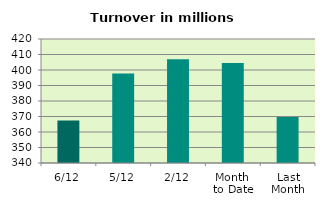
| Category | Series 0 |
|---|---|
| 6/12 | 367.499 |
| 5/12 | 397.762 |
| 2/12 | 406.886 |
| Month 
to Date | 404.548 |
| Last
Month | 369.747 |